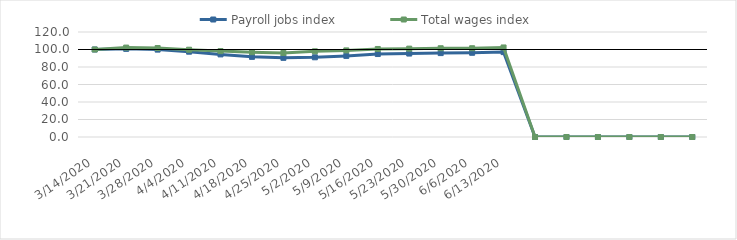
| Category | Payroll jobs index | Total wages index |
|---|---|---|
| 14/03/2020 | 100 | 100 |
| 21/03/2020 | 100.737 | 102.189 |
| 28/03/2020 | 99.872 | 101.694 |
| 04/04/2020 | 97.485 | 99.733 |
| 11/04/2020 | 94.398 | 98.153 |
| 18/04/2020 | 91.583 | 96.979 |
| 25/04/2020 | 90.471 | 96.061 |
| 02/05/2020 | 91.097 | 97.915 |
| 09/05/2020 | 92.685 | 98.978 |
| 16/05/2020 | 94.819 | 100.598 |
| 23/05/2020 | 95.361 | 100.971 |
| 30/05/2020 | 95.878 | 101.433 |
| 06/06/2020 | 96.245 | 101.45 |
| 13/06/2020 | 97.008 | 102.33 |